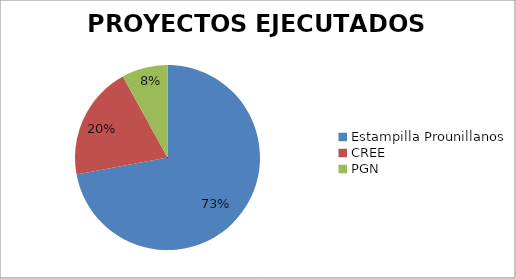
| Category | EJECUTADO |
|---|---|
| Estampilla Prounillanos | 10333107674 |
| CREE | 2853188771 |
| PGN | 1149462529 |